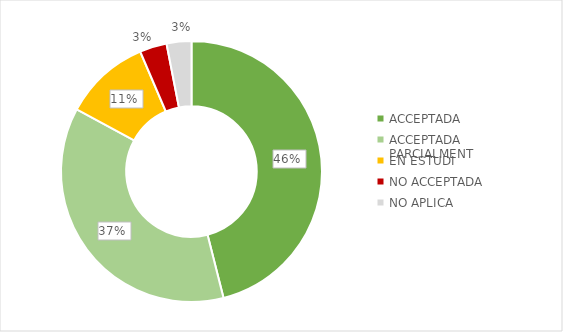
| Category | Series 0 |
|---|---|
| ACCEPTADA | 315 |
| ACCEPTADA PARCIALMENT | 252 |
| EN ESTUDI | 73 |
| NO ACCEPTADA | 23 |
| NO APLICA | 21 |